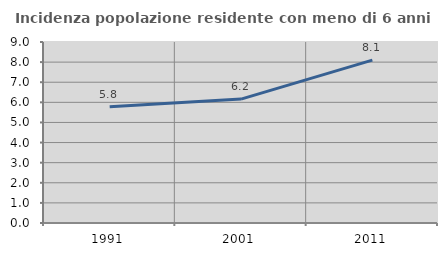
| Category | Incidenza popolazione residente con meno di 6 anni |
|---|---|
| 1991.0 | 5.784 |
| 2001.0 | 6.162 |
| 2011.0 | 8.098 |